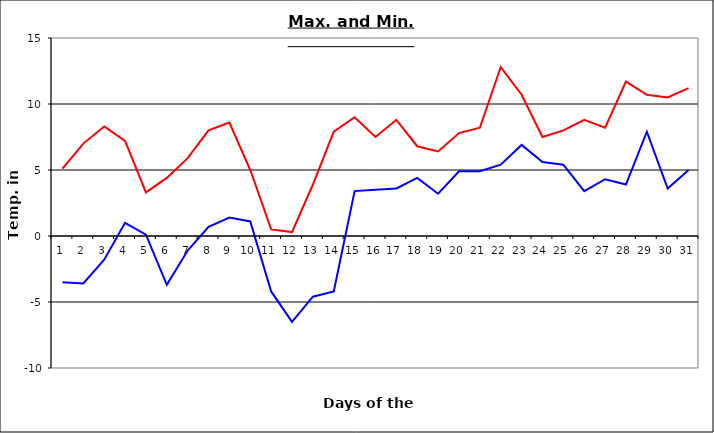
| Category | Series 0 | Series 1 |
|---|---|---|
| 0 | 5.1 | -3.5 |
| 1 | 7 | -3.6 |
| 2 | 8.3 | -1.8 |
| 3 | 7.2 | 1 |
| 4 | 3.3 | 0.1 |
| 5 | 4.4 | -3.7 |
| 6 | 5.9 | -1.1 |
| 7 | 8 | 0.7 |
| 8 | 8.6 | 1.4 |
| 9 | 5 | 1.1 |
| 10 | 0.5 | -4.2 |
| 11 | 0.3 | -6.5 |
| 12 | 3.9 | -4.6 |
| 13 | 7.9 | -4.2 |
| 14 | 9 | 3.4 |
| 15 | 7.5 | 3.5 |
| 16 | 8.8 | 3.6 |
| 17 | 6.8 | 4.4 |
| 18 | 6.4 | 3.2 |
| 19 | 7.8 | 4.9 |
| 20 | 8.2 | 4.9 |
| 21 | 12.8 | 5.4 |
| 22 | 10.7 | 6.9 |
| 23 | 7.5 | 5.6 |
| 24 | 8 | 5.4 |
| 25 | 8.8 | 3.4 |
| 26 | 8.2 | 4.3 |
| 27 | 11.7 | 3.9 |
| 28 | 10.7 | 7.9 |
| 29 | 10.5 | 3.6 |
| 30 | 11.2 | 5 |